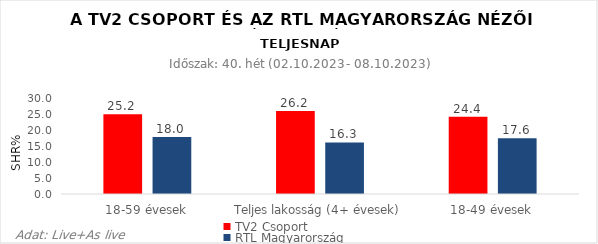
| Category | TV2 Csoport | RTL Magyarország |
|---|---|---|
| 18-59 évesek | 25.2 | 18 |
| Teljes lakosság (4+ évesek) | 26.2 | 16.3 |
| 18-49 évesek | 24.4 | 17.6 |